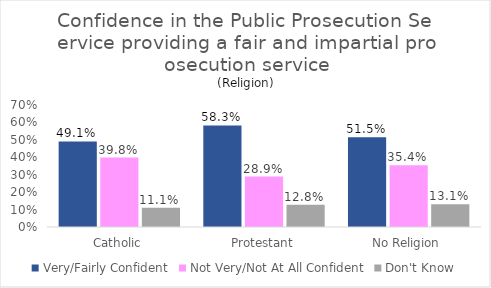
| Category | Very/Fairly Confident | Not Very/Not At All Confident | Don't Know |
|---|---|---|---|
| Catholic | 0.491 | 0.398 | 0.111 |
| Protestant | 0.583 | 0.289 | 0.128 |
| No Religion | 0.515 | 0.354 | 0.131 |